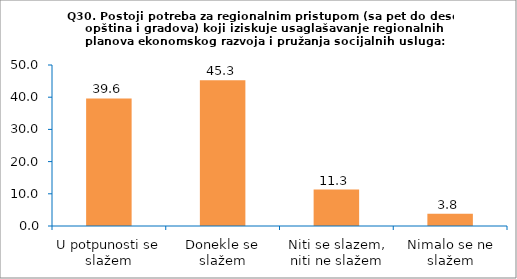
| Category | Series 0 |
|---|---|
| U potpunosti se slažem | 39.623 |
| Donekle se slažem | 45.283 |
| Niti se slazem, niti ne slažem | 11.321 |
| Nimalo se ne slažem | 3.774 |